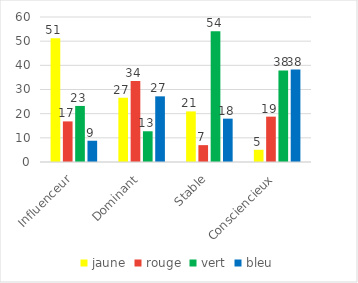
| Category | jaune | rouge | vert | bleu |
|---|---|---|---|---|
| Influenceur | 51.2 | 16.8 | 23.2 | 8.8 |
| Dominant | 26.59 | 33.526 | 12.717 | 27.168 |
| Stable | 20.93 | 6.977 | 54.153 | 17.94 |
| Consciencieux | 5.054 | 18.773 | 37.906 | 38.267 |